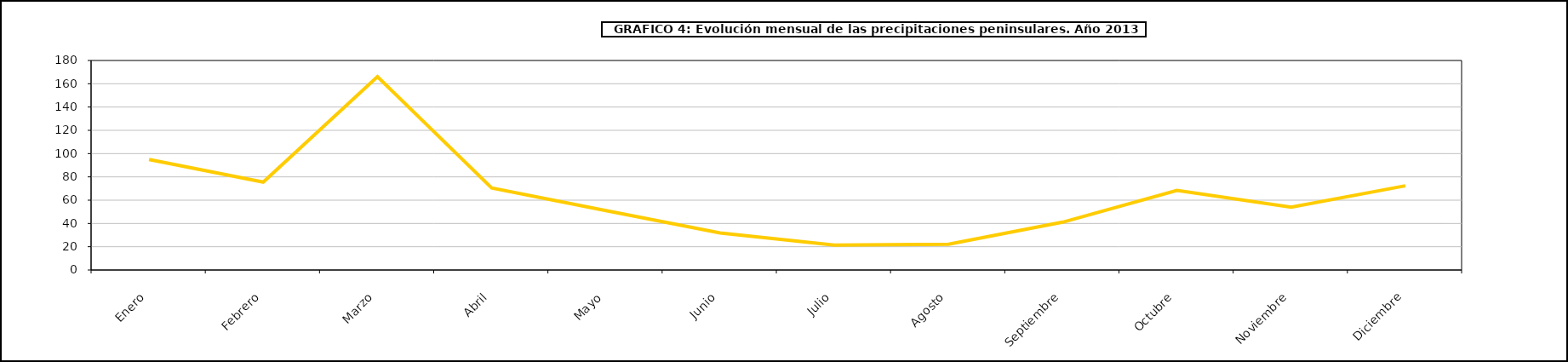
| Category | peninsula |
|---|---|
|  Enero | 94.953 |
|  Febrero | 75.537 |
|  Marzo | 166.052 |
|  Abril | 70.427 |
|  Mayo | 51.092 |
|  Junio | 31.847 |
|  Julio | 21.493 |
|  Agosto | 22.169 |
|  Septiembre | 41.115 |
|  Octubre | 68.445 |
|  Noviembre | 54.062 |
|  Diciembre | 72.359 |